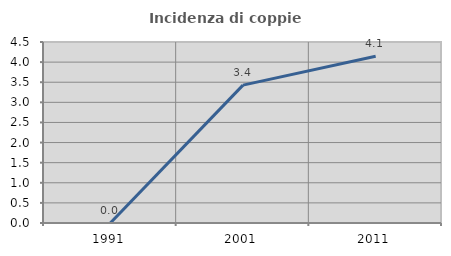
| Category | Incidenza di coppie miste |
|---|---|
| 1991.0 | 0 |
| 2001.0 | 3.429 |
| 2011.0 | 4.145 |